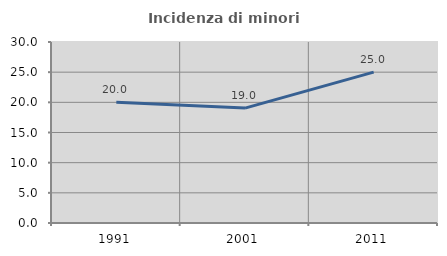
| Category | Incidenza di minori stranieri |
|---|---|
| 1991.0 | 20 |
| 2001.0 | 19.048 |
| 2011.0 | 25 |